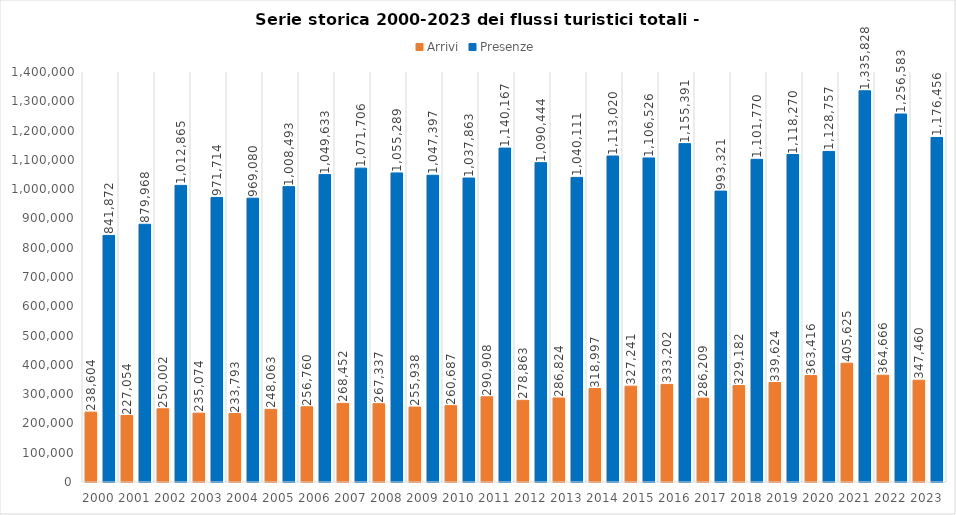
| Category | Arrivi | Presenze |
|---|---|---|
| 2000.0 | 238604 | 841872 |
| 2001.0 | 227054 | 879968 |
| 2002.0 | 250002 | 1012865 |
| 2003.0 | 235074 | 971714 |
| 2004.0 | 233793 | 969080 |
| 2005.0 | 248063 | 1008493 |
| 2006.0 | 256760 | 1049633 |
| 2007.0 | 268452 | 1071706 |
| 2008.0 | 267337 | 1055289 |
| 2009.0 | 255938 | 1047397 |
| 2010.0 | 260687 | 1037863 |
| 2011.0 | 290908 | 1140167 |
| 2012.0 | 278863 | 1090444 |
| 2013.0 | 286824 | 1040111 |
| 2014.0 | 318997 | 1113020 |
| 2015.0 | 327241 | 1106526 |
| 2016.0 | 333202 | 1155391 |
| 2017.0 | 286209 | 993321 |
| 2018.0 | 329182 | 1101770 |
| 2019.0 | 339624 | 1118270 |
| 2020.0 | 363416 | 1128757 |
| 2021.0 | 405625 | 1335828 |
| 2022.0 | 364666 | 1256583 |
| 2023.0 | 347460 | 1176456 |